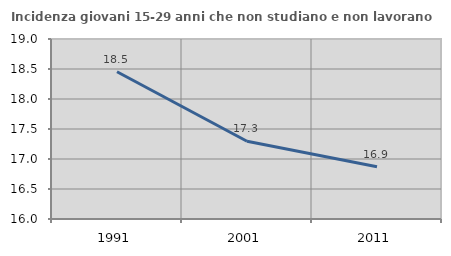
| Category | Incidenza giovani 15-29 anni che non studiano e non lavorano  |
|---|---|
| 1991.0 | 18.453 |
| 2001.0 | 17.295 |
| 2011.0 | 16.87 |